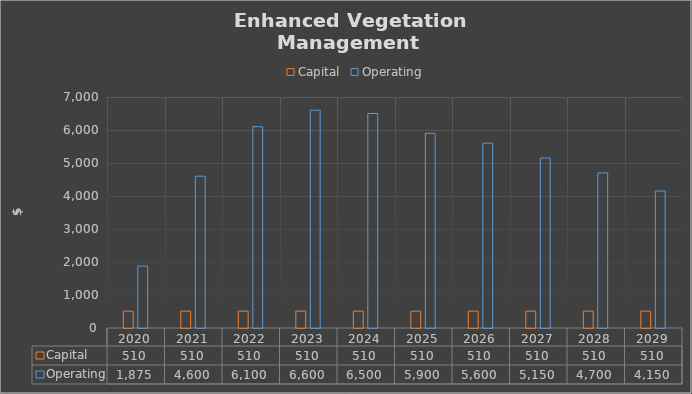
| Category | Capital | Operating |
|---|---|---|
| 2020.0 | 510 | 1875 |
| 2021.0 | 510 | 4600 |
| 2022.0 | 510 | 6100 |
| 2023.0 | 510 | 6600 |
| 2024.0 | 510 | 6500 |
| 2025.0 | 510 | 5900 |
| 2026.0 | 510 | 5600 |
| 2027.0 | 510 | 5150 |
| 2028.0 | 510 | 4700 |
| 2029.0 | 510 | 4150 |